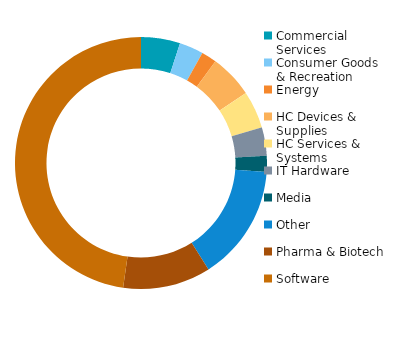
| Category | 2016 |
|---|---|
| Commercial Services | 3.465 |
| Consumer Goods & Recreation | 2.132 |
| Energy | 1.35 |
| HC Devices & Supplies | 3.859 |
| HC Services & Systems | 3.317 |
| IT Hardware | 2.517 |
| Media | 1.424 |
| Other | 10.271 |
| Pharma & Biotech | 7.79 |
| Software | 32.982 |